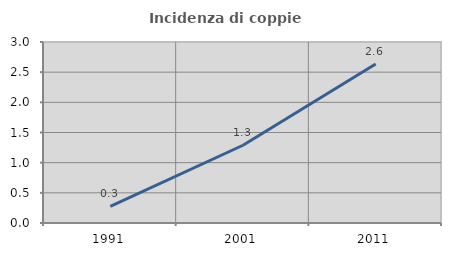
| Category | Incidenza di coppie miste |
|---|---|
| 1991.0 | 0.274 |
| 2001.0 | 1.289 |
| 2011.0 | 2.635 |